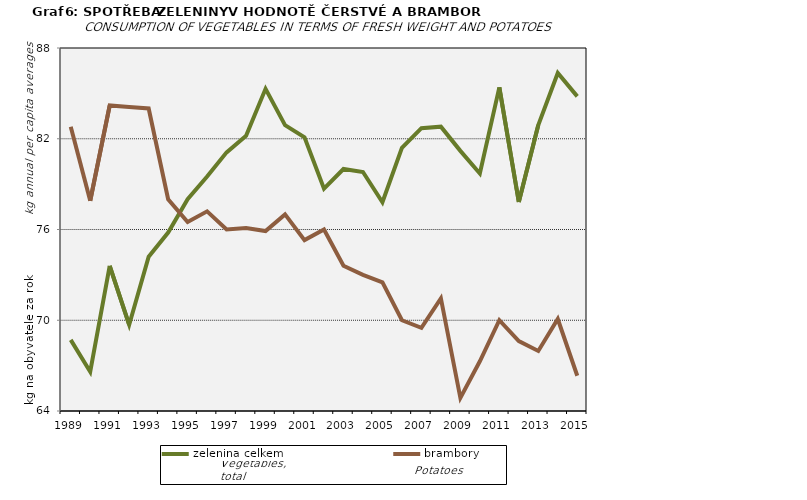
| Category | zelenina celkem | brambory |
|---|---|---|
| 1989.0 | 68.7 | 82.8 |
| 1990.0 | 66.6 | 77.9 |
| 1991.0 | 73.6 | 84.2 |
| 1992.0 | 69.7 | 84.1 |
| 1993.0 | 74.2 | 84 |
| 1994.0 | 75.8 | 78 |
| 1995.0 | 78 | 76.5 |
| 1996.0 | 79.5 | 77.2 |
| 1997.0 | 81.1 | 76 |
| 1998.0 | 82.2 | 76.1 |
| 1999.0 | 85.3 | 75.9 |
| 2000.0 | 82.9 | 77 |
| 2001.0 | 82.1 | 75.3 |
| 2002.0 | 78.7 | 76 |
| 2003.0 | 80 | 73.6 |
| 2004.0 | 79.8 | 73 |
| 2005.0 | 77.8 | 72.5 |
| 2006.0 | 81.4 | 70 |
| 2007.0 | 82.7 | 69.5 |
| 2008.0 | 82.8 | 71.44 |
| 2009.0 | 81.2 | 64.87 |
| 2010.0 | 79.7 | 67.29 |
| 2011.0 | 85.4 | 70 |
| 2012.0 | 77.82 | 68.62 |
| 2013.0 | 82.91 | 67.97 |
| 2014.0 | 86.35 | 70.08 |
| 2015.0 | 84.8 | 66.33 |